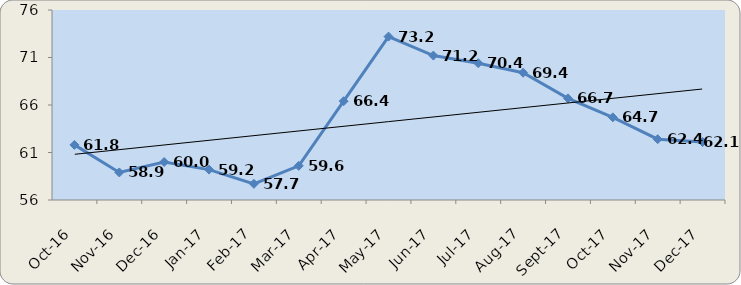
| Category | out/16 nov/16 dez/16 jan/17 fev/17 mar/17 abr/17 mai/17 jun/17 jul/17 ago/17 set/17 out/17 nov/17 dez/17 |
|---|---|
| 2016-10-01 | 61.8 |
| 2016-11-01 | 58.9 |
| 2016-12-01 | 60 |
| 2017-01-01 | 59.2 |
| 2017-02-01 | 57.7 |
| 2017-03-01 | 59.6 |
| 2017-04-01 | 66.4 |
| 2017-05-01 | 73.2 |
| 2017-06-01 | 71.2 |
| 2017-07-01 | 70.4 |
| 2017-08-01 | 69.4 |
| 2017-09-01 | 66.7 |
| 2017-10-01 | 64.7 |
| 2017-11-01 | 62.4 |
| 2017-12-01 | 62.1 |